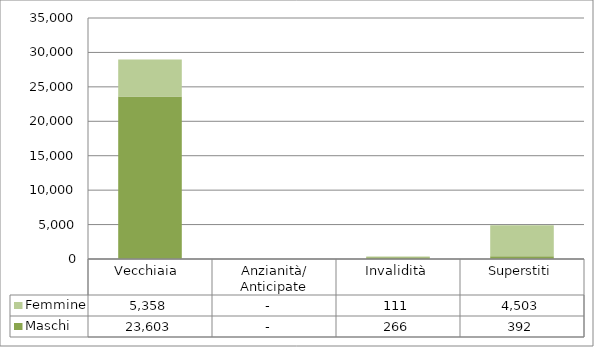
| Category | Maschi | Femmine |
|---|---|---|
| Vecchiaia  | 23603 | 5358 |
| Anzianità/ Anticipate | 0 | 0 |
| Invalidità | 266 | 111 |
| Superstiti | 392 | 4503 |